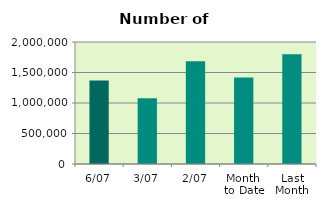
| Category | Series 0 |
|---|---|
| 6/07 | 1368114 |
| 3/07 | 1079514 |
| 2/07 | 1685196 |
| Month 
to Date | 1418414.5 |
| Last
Month | 1799892.818 |